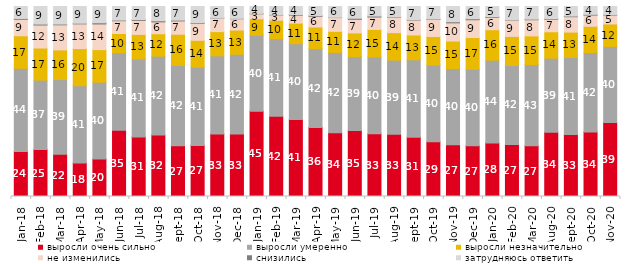
| Category | выросли очень сильно | выросли умеренно | выросли незначительно | не изменились | снизились | затрудняюсь ответить |
|---|---|---|---|---|---|---|
| 2018-01-01 | 23.75 | 43.7 | 17.15 | 8.65 | 0.45 | 6.3 |
| 2018-02-01 | 24.7 | 36.55 | 16.9 | 12.1 | 0.5 | 9.25 |
| 2018-03-01 | 22.25 | 39.3 | 15.6 | 13.2 | 0.4 | 9.25 |
| 2018-04-01 | 17.65 | 40.65 | 19.55 | 13 | 0.35 | 8.8 |
| 2018-05-01 | 19.75 | 40.4 | 17.15 | 13.5 | 0.65 | 8.55 |
| 2018-06-01 | 34.85 | 40.8 | 10.15 | 6.7 | 0.35 | 7.15 |
| 2018-07-01 | 31.3 | 41.05 | 12.9 | 7.4 | 0.45 | 6.85 |
| 2018-08-01 | 32.35 | 41.5 | 11.8 | 6.25 | 0.6 | 7.5 |
| 2018-09-01 | 26.7 | 42.3 | 16.4 | 7 | 0.45 | 7.15 |
| 2018-10-01 | 26.9 | 41.15 | 14.15 | 8.9 | 0.35 | 8.55 |
| 2018-11-01 | 32.934 | 41.068 | 12.774 | 7.036 | 0.1 | 6.088 |
| 2018-12-01 | 32.85 | 42 | 12.75 | 5.95 | 0.2 | 6.25 |
| 2019-01-01 | 44.85 | 39.95 | 8.75 | 2.6 | 0.2 | 3.65 |
| 2019-02-01 | 42.2 | 40.85 | 9.75 | 2.7 | 0.1 | 4.4 |
| 2019-03-01 | 40.527 | 39.881 | 10.84 | 4.177 | 0.348 | 4.227 |
| 2019-04-01 | 36.337 | 41.535 | 11.337 | 5.594 | 0.396 | 4.802 |
| 2019-05-01 | 33.531 | 42.298 | 11.095 | 7.231 | 0.149 | 5.696 |
| 2019-06-01 | 34.763 | 38.853 | 12.469 | 7.132 | 0.599 | 6.185 |
| 2019-07-01 | 32.97 | 40.446 | 14.505 | 6.535 | 0.545 | 5 |
| 2019-08-01 | 32.767 | 39.011 | 14.436 | 8.192 | 0.25 | 5.345 |
| 2019-09-01 | 31.188 | 40.743 | 13.069 | 7.871 | 0.248 | 6.881 |
| 2019-10-01 | 28.762 | 40.347 | 15.099 | 8.96 | 0.248 | 6.584 |
| 2019-11-01 | 27.178 | 40.149 | 14.505 | 9.554 | 0.594 | 8.02 |
| 2019-12-01 | 26.683 | 40.297 | 16.683 | 9.356 | 0.545 | 6.436 |
| 2020-01-01 | 28.218 | 43.515 | 16.04 | 6.436 | 0.396 | 5.396 |
| 2020-02-01 | 27.426 | 41.535 | 15.297 | 8.614 | 0.198 | 6.931 |
| 2020-03-01 | 26.673 | 42.786 | 15.072 | 8.478 | 0.347 | 6.644 |
| 2020-08-01 | 33.813 | 38.977 | 13.903 | 6.554 | 0.348 | 6.405 |
| 2020-09-01 | 32.603 | 40.567 | 13.34 | 8.113 | 0.348 | 5.027 |
| 2020-10-01 | 33.981 | 41.704 | 13.901 | 5.879 | 0.399 | 4.136 |
| 2020-11-01 | 39 | 40 | 11.8 | 4.7 | 0.25 | 4.25 |